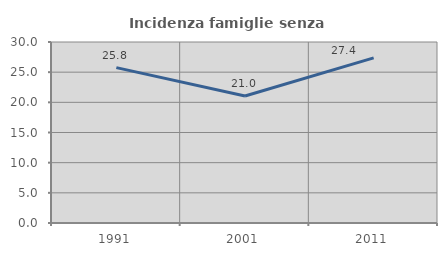
| Category | Incidenza famiglie senza nuclei |
|---|---|
| 1991.0 | 25.757 |
| 2001.0 | 21.048 |
| 2011.0 | 27.36 |